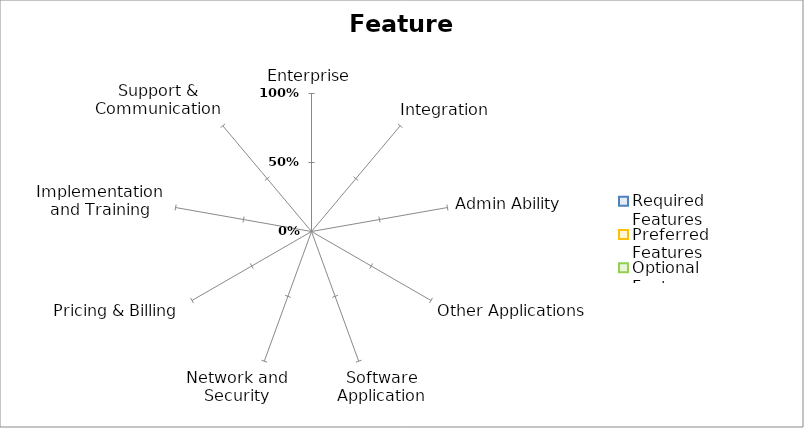
| Category | Required Features | Preferred Features | Optional Features |
|---|---|---|---|
| Enterprise | 0 | 0 | 0 |
| Integration | 0 | 0 | 0 |
| Admin Ability | 0 | 0 | 0 |
| Other Applications | 0 | 0 | 0 |
| Software Application | 0 | 0 | 0 |
| Network and Security | 0 | 0 | 0 |
| Pricing & Billing | 0 | 0 | 0 |
| Implementation and Training | 0 | 0 | 0 |
| Support & Communication | 0 | 0 | 0 |